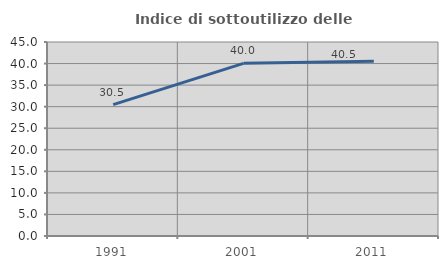
| Category | Indice di sottoutilizzo delle abitazioni  |
|---|---|
| 1991.0 | 30.462 |
| 2001.0 | 40.044 |
| 2011.0 | 40.524 |